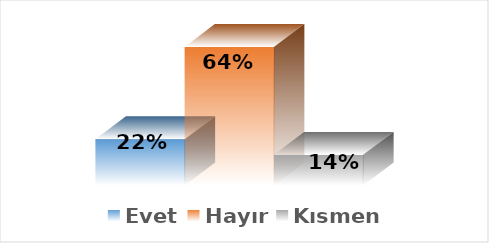
| Category | Evet | Hayır | Kısmen |
|---|---|---|---|
| 0 | 0.214 | 0.643 | 0.143 |